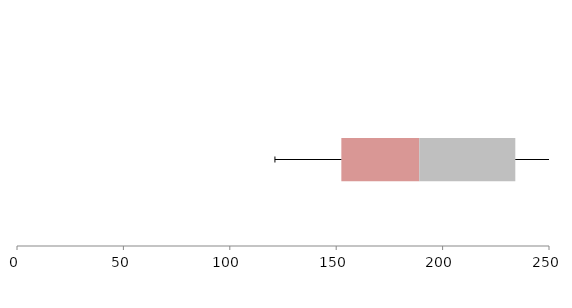
| Category | Series 1 | Series 2 | Series 3 |
|---|---|---|---|
| 0 | 152.422 | 36.608 | 45.135 |